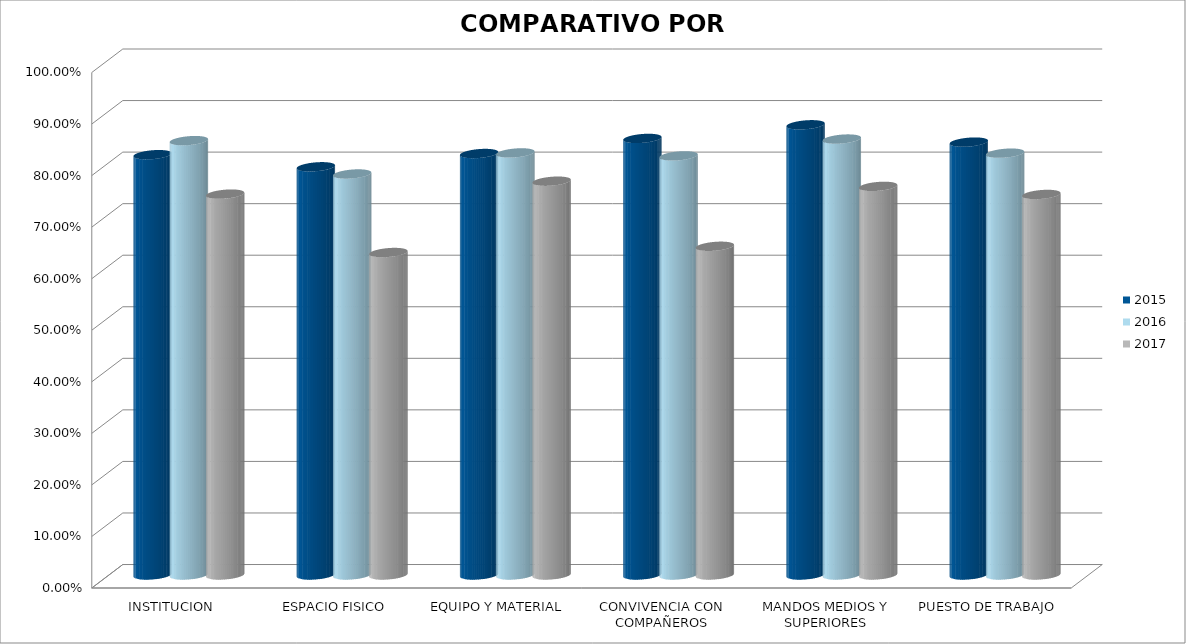
| Category | 2015 | 2016 | 2017 |
|---|---|---|---|
| INSTITUCION | 0.815 | 0.843 | 0.739 |
| ESPACIO FISICO | 0.792 | 0.778 | 0.626 |
| EQUIPO Y MATERIAL | 0.818 | 0.819 | 0.764 |
| CONVIVENCIA CON COMPAÑEROS | 0.847 | 0.813 | 0.638 |
| MANDOS MEDIOS Y SUPERIORES | 0.873 | 0.846 | 0.754 |
| PUESTO DE TRABAJO | 0.84 | 0.818 | 0.738 |